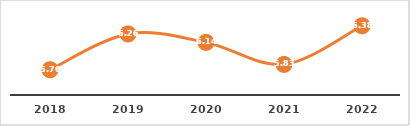
| Category | ABSORCIÓN DE EGRESADOS DE SECUNDARIA (%) |
|---|---|
| 2018.0 | 5.756 |
| 2019.0 | 6.262 |
| 2020.0 | 6.143 |
| 2021.0 | 5.831 |
| 2022.0 | 6.377 |